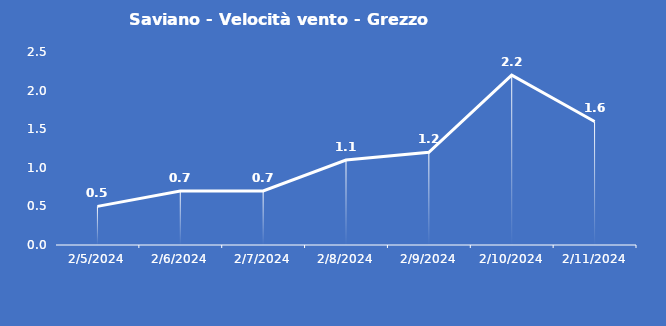
| Category | Saviano - Velocità vento - Grezzo (m/s) |
|---|---|
| 2/5/24 | 0.5 |
| 2/6/24 | 0.7 |
| 2/7/24 | 0.7 |
| 2/8/24 | 1.1 |
| 2/9/24 | 1.2 |
| 2/10/24 | 2.2 |
| 2/11/24 | 1.6 |